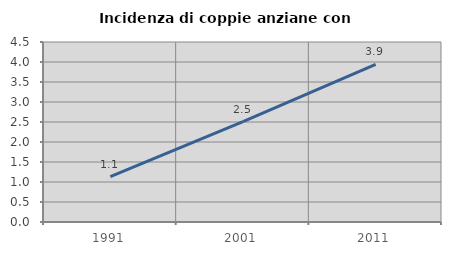
| Category | Incidenza di coppie anziane con figli |
|---|---|
| 1991.0 | 1.135 |
| 2001.0 | 2.509 |
| 2011.0 | 3.943 |